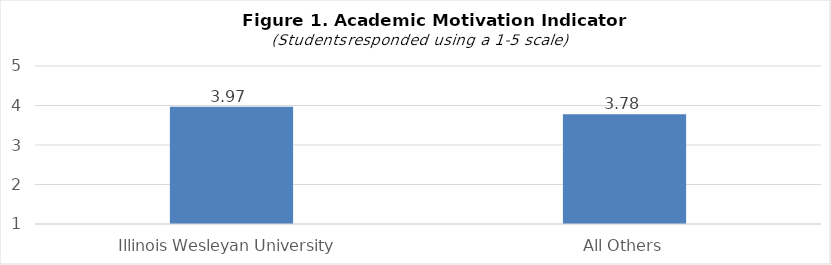
| Category | Series 0 |
|---|---|
| Illinois Wesleyan University | 3.97 |
| All Others | 3.78 |